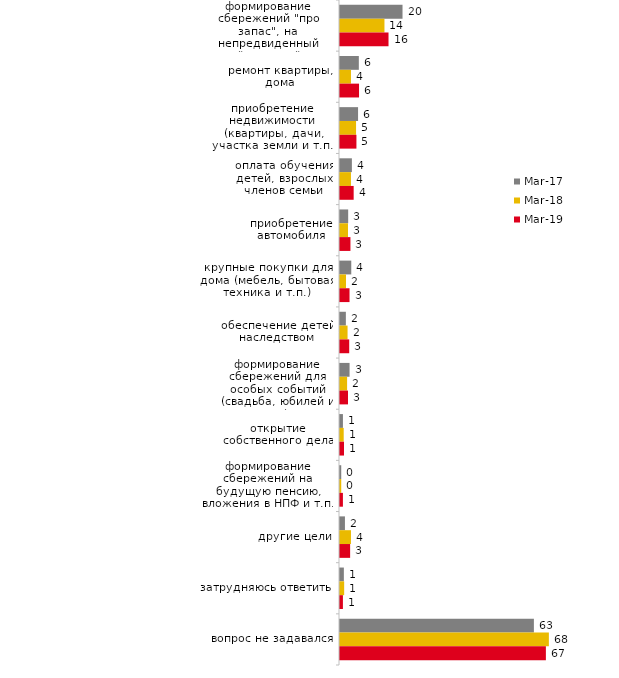
| Category | мар.17 | мар.18 | мар.19 |
|---|---|---|---|
| формирование сбережений "про запас", на непредвиденный случай, "чёрный день" | 20.25 | 14.4 | 15.714 |
| ремонт квартиры, дома | 6.1 | 3.55 | 6.166 |
| приобретение недвижимости (квартиры, дачи, участка земли и т.п.) | 5.85 | 5.2 | 5.321 |
| оплата обучения детей, взрослых членов семьи | 3.85 | 3.55 | 4.426 |
| приобретение автомобиля | 2.65 | 2.6 | 3.381 |
| крупные покупки для дома (мебель, бытовая техника и т.п.) | 3.65 | 1.95 | 3.083 |
| обеспечение детей наследством | 1.9 | 2.45 | 2.984 |
| формирование сбережений для особых событий (свадьба, юбилей и т.п.) | 3.1 | 2.3 | 2.586 |
| открытие собственного дела | 0.95 | 1.2 | 1.293 |
| формирование сбережений на будущую пенсию, вложения в НПФ и т.п. | 0.4 | 0.4 | 0.945 |
| другие цели | 1.6 | 3.55 | 3.282 |
| затрудняюсь ответить | 1.25 | 1.35 | 0.945 |
| вопрос не задавался | 62.8 | 67.65 | 66.683 |